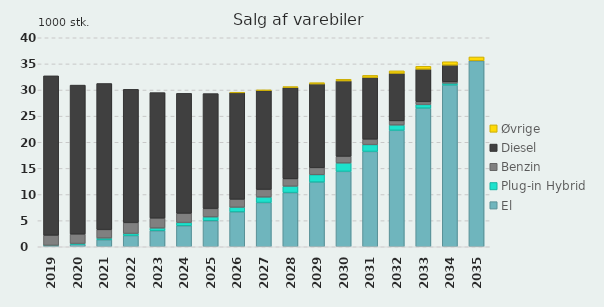
| Category | El | Plug-in Hybrid | Benzin | Diesel | Øvrige |
|---|---|---|---|---|---|
| 2019 | 0.24 | 0.03 | 1.94 | 30.5 | 0 |
| 2020 | 0.46 | 0.16 | 1.8 | 28.52 | 0 |
| 2021 | 1.33 | 0.33 | 1.62 | 27.97 | 0 |
| 2022 | 2.14 | 0.4 | 2.09 | 25.5 | 0 |
| 2023 | 3.07 | 0.51 | 1.9 | 24.02 | 0 |
| 2024 | 4.02 | 0.62 | 1.76 | 22.96 | 0 |
| 2025 | 4.98 | 0.73 | 1.61 | 21.99 | 0 |
| 2026 | 6.67 | 0.89 | 1.54 | 20.38 | 0.06 |
| 2027 | 8.46 | 1.05 | 1.47 | 18.91 | 0.12 |
| 2028 | 10.36 | 1.23 | 1.41 | 17.47 | 0.18 |
| 2029 | 12.38 | 1.41 | 1.35 | 16.02 | 0.25 |
| 2030 | 14.43 | 1.6 | 1.28 | 14.43 | 0.32 |
| 2031 | 18.24 | 1.31 | 1.05 | 11.81 | 0.39 |
| 2032 | 22.29 | 1.01 | 0.81 | 9.09 | 0.47 |
| 2033 | 26.53 | 0.69 | 0.55 | 6.22 | 0.55 |
| 2034 | 30.95 | 0.35 | 0.28 | 3.19 | 0.64 |
| 2035 | 35.6 | 0 | 0 | 0 | 0.73 |